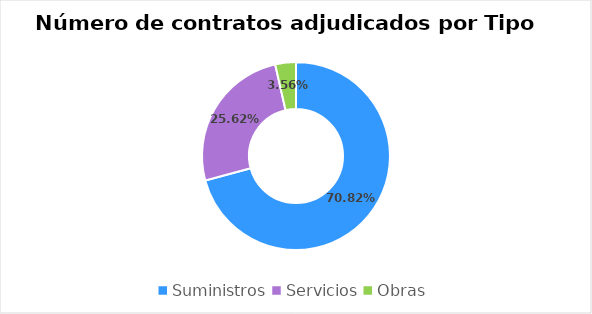
| Category | Series 0 |
|---|---|
| Suministros | 0.708 |
| Servicios | 0.256 |
| Obras | 0.036 |